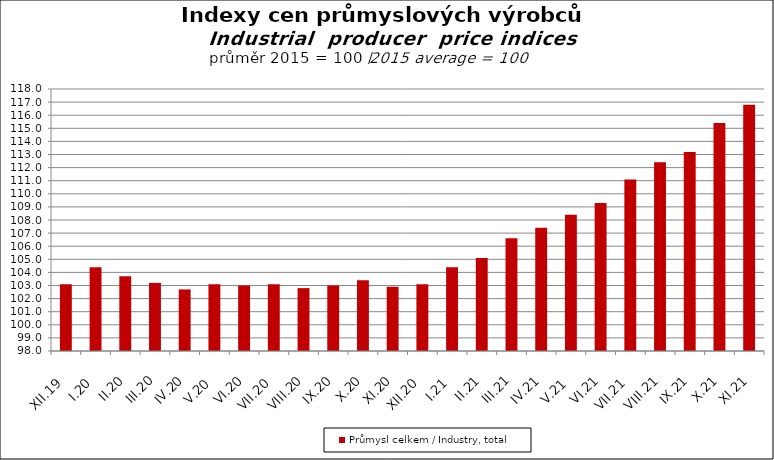
| Category | Průmysl celkem / Industry, total |
|---|---|
| XII.19 | 103.1 |
| I.20 | 104.4 |
| II.20 | 103.7 |
| III.20 | 103.2 |
| IV.20 | 102.7 |
| V.20 | 103.1 |
| VI.20 | 103 |
| VII.20 | 103.1 |
| VIII.20 | 102.8 |
| IX.20 | 103 |
| X.20 | 103.4 |
| XI.20 | 102.9 |
| XII.20 | 103.1 |
| I.21 | 104.4 |
| II.21 | 105.1 |
| III.21 | 106.6 |
| IV.21 | 107.4 |
| V.21 | 108.4 |
| VI.21 | 109.3 |
| VII.21 | 111.1 |
| VIII.21 | 112.4 |
| IX.21 | 113.2 |
| X.21 | 115.4 |
| XI.21 | 116.8 |